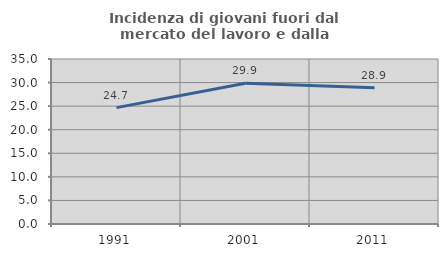
| Category | Incidenza di giovani fuori dal mercato del lavoro e dalla formazione  |
|---|---|
| 1991.0 | 24.69 |
| 2001.0 | 29.87 |
| 2011.0 | 28.925 |